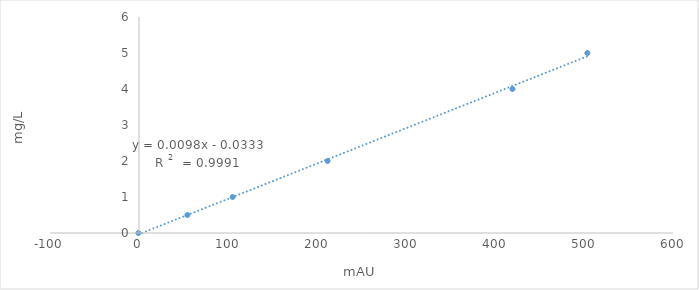
| Category | Series 0 |
|---|---|
| -0.633 | 0 |
| 54.375 | 0.5 |
| 105.17 | 1 |
| 211.816 | 2 |
| 419.632 | 4 |
| 503.808 | 5 |